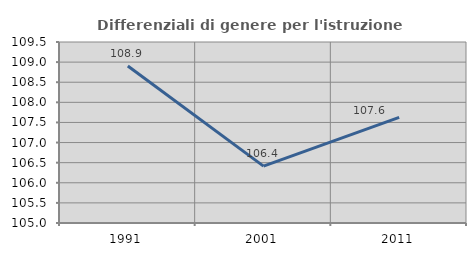
| Category | Differenziali di genere per l'istruzione superiore |
|---|---|
| 1991.0 | 108.905 |
| 2001.0 | 106.414 |
| 2011.0 | 107.626 |